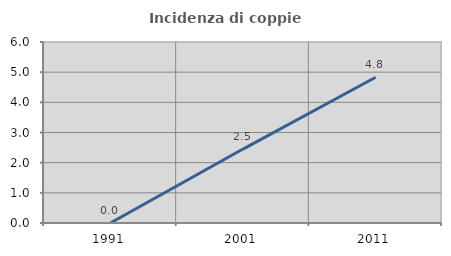
| Category | Incidenza di coppie miste |
|---|---|
| 1991.0 | 0 |
| 2001.0 | 2.451 |
| 2011.0 | 4.831 |